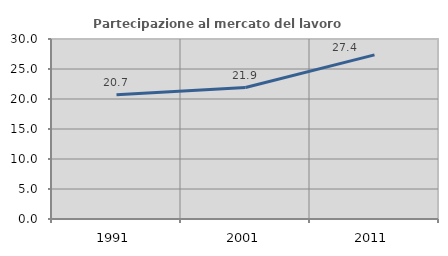
| Category | Partecipazione al mercato del lavoro  femminile |
|---|---|
| 1991.0 | 20.724 |
| 2001.0 | 21.906 |
| 2011.0 | 27.355 |